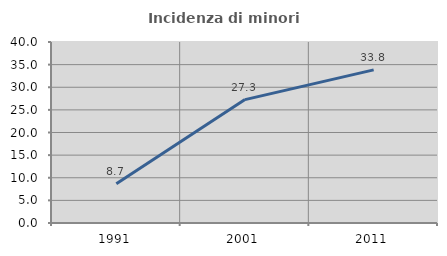
| Category | Incidenza di minori stranieri |
|---|---|
| 1991.0 | 8.696 |
| 2001.0 | 27.273 |
| 2011.0 | 33.846 |